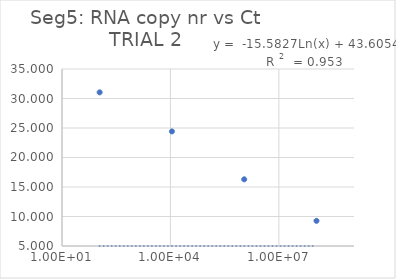
| Category | Series 0 |
|---|---|
| 110000000.0 | 9.265 |
| 1100000.0 | 16.302 |
| 11000.0 | 24.418 |
| 110.0 | 31.041 |